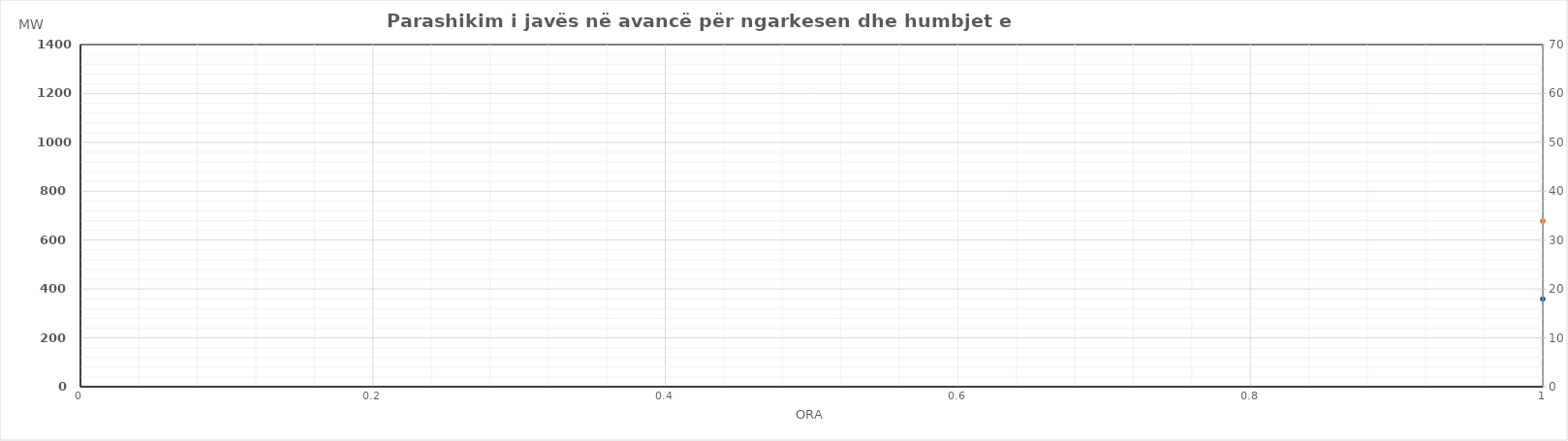
| Category | Ngarkesa (MWh) |
|---|---|
| 0 | 677.78 |
| 1 | 606.02 |
| 2 | 567.46 |
| 3 | 607.74 |
| 4 | 631.14 |
| 5 | 664.99 |
| 6 | 777.34 |
| 7 | 954.55 |
| 8 | 1055.22 |
| 9 | 1037.78 |
| 10 | 1006.87 |
| 11 | 1005.76 |
| 12 | 982.48 |
| 13 | 922.81 |
| 14 | 903.21 |
| 15 | 853.51 |
| 16 | 845.07 |
| 17 | 891.19 |
| 18 | 941.2 |
| 19 | 1024.01 |
| 20 | 1055.15 |
| 21 | 972.94 |
| 22 | 878.29 |
| 23 | 737.36 |
| 24 | 580.64 |
| 25 | 532.09 |
| 26 | 503.87 |
| 27 | 539.44 |
| 28 | 549.76 |
| 29 | 585.03 |
| 30 | 692.96 |
| 31 | 860.14 |
| 32 | 923.1 |
| 33 | 974.48 |
| 34 | 990.75 |
| 35 | 1016.92 |
| 36 | 1022.58 |
| 37 | 997.7 |
| 38 | 928.92 |
| 39 | 851.41 |
| 40 | 887.02 |
| 41 | 1001.27 |
| 42 | 1052.73 |
| 43 | 1132.66 |
| 44 | 1167.36 |
| 45 | 1083 |
| 46 | 967.59 |
| 47 | 826.68 |
| 48 | 617.76 |
| 49 | 592.81 |
| 50 | 590.78 |
| 51 | 624.96 |
| 52 | 627.37 |
| 53 | 623.93 |
| 54 | 714.63 |
| 55 | 861.25 |
| 56 | 919.81 |
| 57 | 907.8 |
| 58 | 882.36 |
| 59 | 912.14 |
| 60 | 932.09 |
| 61 | 920.71 |
| 62 | 889.94 |
| 63 | 807.92 |
| 64 | 821.63 |
| 65 | 826.01 |
| 66 | 898.89 |
| 67 | 960.59 |
| 68 | 986.33 |
| 69 | 909.88 |
| 70 | 801.77 |
| 71 | 669 |
| 72 | 633.53 |
| 73 | 615.91 |
| 74 | 610.88 |
| 75 | 653.14 |
| 76 | 654.76 |
| 77 | 650.11 |
| 78 | 757.82 |
| 79 | 928.42 |
| 80 | 983.05 |
| 81 | 992.84 |
| 82 | 983.23 |
| 83 | 979.02 |
| 84 | 964.56 |
| 85 | 924.89 |
| 86 | 911.61 |
| 87 | 855.51 |
| 88 | 861.93 |
| 89 | 902.66 |
| 90 | 957.33 |
| 91 | 1049.95 |
| 92 | 1111.85 |
| 93 | 1033.65 |
| 94 | 909.62 |
| 95 | 762.33 |
| 96 | 655.12 |
| 97 | 594.39 |
| 98 | 580.64 |
| 99 | 621.91 |
| 100 | 626.02 |
| 101 | 666.51 |
| 102 | 760.99 |
| 103 | 922.35 |
| 104 | 988.88 |
| 105 | 963.95 |
| 106 | 927.74 |
| 107 | 950.79 |
| 108 | 966.33 |
| 109 | 912.42 |
| 110 | 899.53 |
| 111 | 851.04 |
| 112 | 867.75 |
| 113 | 922.16 |
| 114 | 974.25 |
| 115 | 1041.62 |
| 116 | 1066.93 |
| 117 | 990.66 |
| 118 | 907.17 |
| 119 | 760.26 |
| 120 | 672.35 |
| 121 | 619.53 |
| 122 | 593.19 |
| 123 | 590.67 |
| 124 | 600.42 |
| 125 | 637.41 |
| 126 | 740.79 |
| 127 | 876.81 |
| 128 | 957.44 |
| 129 | 973.46 |
| 130 | 952.16 |
| 131 | 935.83 |
| 132 | 883.09 |
| 133 | 897.09 |
| 134 | 858.59 |
| 135 | 834.96 |
| 136 | 796.25 |
| 137 | 838.38 |
| 138 | 899.84 |
| 139 | 982.37 |
| 140 | 1029.47 |
| 141 | 960.99 |
| 142 | 844.03 |
| 143 | 729.43 |
| 144 | 619.86 |
| 145 | 590.34 |
| 146 | 553.39 |
| 147 | 543.46 |
| 148 | 554.77 |
| 149 | 571.46 |
| 150 | 628.72 |
| 151 | 730.34 |
| 152 | 786.87 |
| 153 | 816.29 |
| 154 | 810.99 |
| 155 | 780.71 |
| 156 | 786.84 |
| 157 | 780.61 |
| 158 | 746.33 |
| 159 | 750.59 |
| 160 | 727.99 |
| 161 | 773.6 |
| 162 | 823.27 |
| 163 | 928.96 |
| 164 | 973.59 |
| 165 | 878.28 |
| 166 | 770.33 |
| 167 | 669.82 |